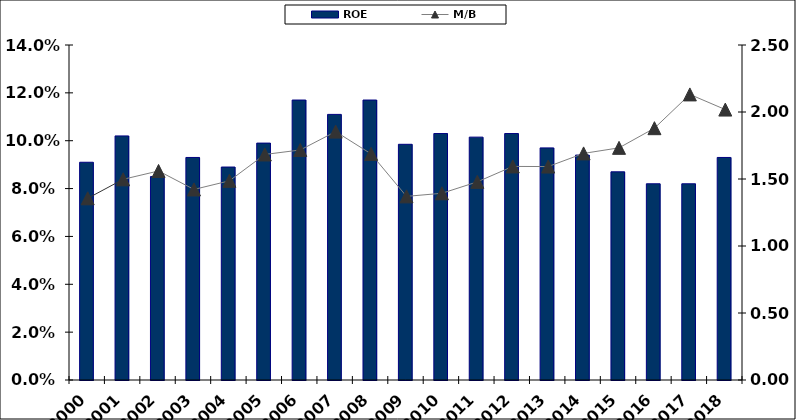
| Category | ROE |
|---|---|
| 2000.0 | 0.091 |
| 2001.0 | 0.102 |
| 2002.0 | 0.085 |
| 2003.0 | 0.093 |
| 2004.0 | 0.089 |
| 2005.0 | 0.099 |
| 2006.0 | 0.117 |
| 2007.0 | 0.111 |
| 2008.0 | 0.117 |
| 2009.0 | 0.098 |
| 2010.0 | 0.103 |
| 2011.0 | 0.102 |
| 2012.0 | 0.103 |
| 2013.0 | 0.097 |
| 2014.0 | 0.094 |
| 2015.0 | 0.087 |
| 2016.0 | 0.082 |
| 2017.0 | 0.082 |
| 2018.0 | 0.093 |